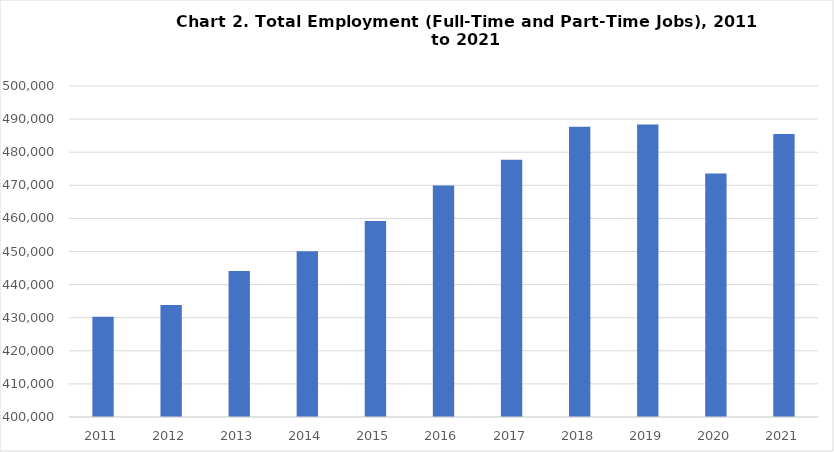
| Category | Series 0 |
|---|---|
| 2011 | 430315 |
| 2012 | 433821 |
| 2013 | 444117 |
| 2014 | 450103 |
| 2015 | 459202 |
| 2016 | 469944 |
| 2017 | 477694 |
| 2018 | 487670 |
| 2019 | 488399 |
| 2020 | 473573 |
| 2021 | 485497 |